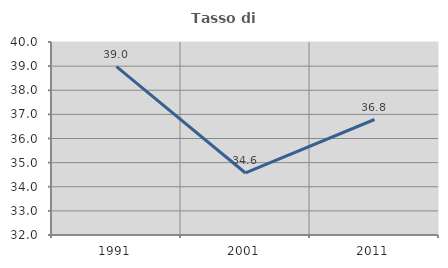
| Category | Tasso di occupazione   |
|---|---|
| 1991.0 | 38.983 |
| 2001.0 | 34.571 |
| 2011.0 | 36.787 |